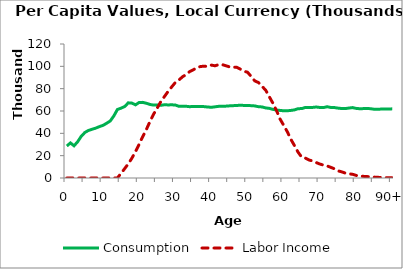
| Category | Consumption | Labor Income |
|---|---|---|
| 0 | 28634.733 | 0 |
|  | 31410.512 | 0 |
| 2 | 28833.109 | 0 |
| 3 | 32461.441 | 0 |
| 4 | 37403.623 | 0 |
| 5 | 40771.973 | 0 |
| 6 | 42605.127 | 0 |
| 7 | 43654.485 | 0 |
| 8 | 44663.926 | 0 |
| 9 | 45994.199 | 0 |
| 10 | 47091.242 | 0 |
| 11 | 49002.363 | 0 |
| 12 | 51020.563 | 0 |
| 13 | 55539.288 | 0 |
| 14 | 61358.588 | 76.44 |
| 15 | 62543.927 | 4127.883 |
| 16 | 64008.194 | 8397.207 |
| 17 | 67301.429 | 12666.53 |
| 18 | 67066.287 | 17768.684 |
| 19 | 65523.377 | 23587.987 |
| 20 | 67634.285 | 30162.352 |
| 21 | 67726.28 | 37080.739 |
| 22 | 66915.37 | 43424.218 |
| 23 | 65876.507 | 50539.365 |
| 24 | 65272.594 | 57191.076 |
| 25 | 65317.185 | 62542.371 |
| 26 | 65067.47 | 68437.155 |
| 27 | 65615.825 | 72926.873 |
| 28 | 65444.338 | 77469.846 |
| 29 | 65533.043 | 81504.058 |
| 30 | 65384.484 | 85508.723 |
| 31 | 64191.487 | 87700.258 |
| 32 | 64183.181 | 90660.115 |
| 33 | 64228.334 | 92587.761 |
| 34 | 63862.748 | 95366.384 |
| 35 | 64071.715 | 96916.442 |
| 36 | 64104.2 | 98978.831 |
| 37 | 64025.503 | 99847.469 |
| 38 | 63907.153 | 100137.829 |
| 39 | 63561.607 | 99808.477 |
| 40 | 63338.815 | 101088.834 |
| 41 | 63748.155 | 100468.31 |
| 42 | 64179.446 | 101548.402 |
| 43 | 64166.529 | 101502.659 |
| 44 | 64353.006 | 100534.602 |
| 45 | 64600.435 | 99516.536 |
| 46 | 64784.742 | 99275.247 |
| 47 | 64917.619 | 99103.183 |
| 48 | 65225.75 | 97496.684 |
| 49 | 64968.316 | 95673.503 |
| 50 | 64881.6 | 94702.165 |
| 51 | 64796.723 | 90879.088 |
| 52 | 64549.703 | 86935.71 |
| 53 | 63846.438 | 85501.05 |
| 54 | 63640.809 | 82102.845 |
| 55 | 62769.894 | 78703.196 |
| 56 | 62373.992 | 72800.948 |
| 57 | 61469.319 | 67021.394 |
| 58 | 60880.214 | 60374.379 |
| 59 | 60497.239 | 52755.965 |
| 60 | 60196.277 | 47071.309 |
| 61 | 60192.88 | 41349.151 |
| 62 | 60543.528 | 34524.906 |
| 63 | 60991.923 | 28847.264 |
| 64 | 62083.667 | 22963.781 |
| 65 | 62170.194 | 18557.128 |
| 66 | 63216.12 | 17821.549 |
| 67 | 63163.105 | 16102.809 |
| 68 | 63204.113 | 15263.277 |
| 69 | 63574.318 | 13798.952 |
| 70 | 63165.532 | 12493.843 |
| 71 | 63075.165 | 11555.831 |
| 72 | 63826.232 | 10805.568 |
| 73 | 63200.039 | 9571.951 |
| 74 | 63086.18 | 8262.659 |
| 75 | 62585.892 | 6401.877 |
| 76 | 62230.85 | 5554.857 |
| 77 | 62170.715 | 4421.121 |
| 78 | 62613.205 | 3727.266 |
| 79 | 63056.542 | 3372.843 |
| 80 | 62363.01 | 2363.982 |
| 81 | 62023.86 | 1616.003 |
| 82 | 62142.342 | 1474.658 |
| 83 | 62237.162 | 1280.93 |
| 84 | 62076.807 | 1052.047 |
| 85 | 61556.89 | 823.519 |
| 86 | 61627.789 | 598.774 |
| 87 | 61698.687 | 463.771 |
| 88 | 61769.586 | 328.767 |
| 89 | 61840.484 | 193.764 |
| 90+ | 61912.34 | 122.435 |